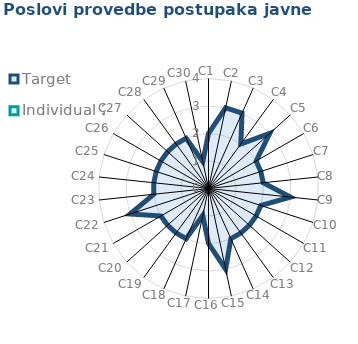
| Category | Target | Individual 2 |
|---|---|---|
| C1 | 2 | 0 |
| C2 | 3 | 0 |
| C3 | 3 | 0 |
| C4 | 2 | 0 |
| C5 | 3 | 0 |
| C6 | 2 | 0 |
| C7 | 2 | 0 |
| C8 | 2 | 0 |
| C9 | 3 | 0 |
| C10 | 2 | 0 |
| C11 | 2 | 0 |
| C12 | 2 | 0 |
| C13 | 2 | 0 |
| C14 | 2 | 0 |
| C15 | 3 | 0 |
| C16 | 2 | 0 |
| C17 | 1 | 0 |
| C18 | 2 | 0 |
| C19 | 2 | 0 |
| C20 | 2 | 0 |
| C21 | 2 | 0 |
| C22 | 3 | 0 |
| C23 | 2 | 0 |
| C24 | 2 | 0 |
| C25 | 2 | 0 |
| C26 | 2 | 0 |
| C27 | 2 | 0 |
| C28 | 2 | 0 |
| C29 | 2 | 0 |
| C30 | 1 | 0 |